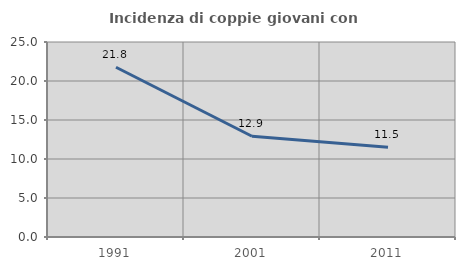
| Category | Incidenza di coppie giovani con figli |
|---|---|
| 1991.0 | 21.765 |
| 2001.0 | 12.92 |
| 2011.0 | 11.511 |